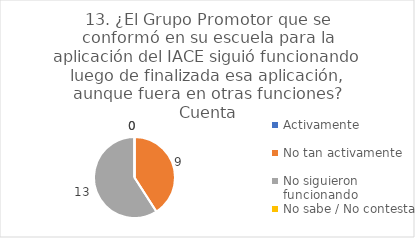
| Category | 13. ¿El Grupo Promotor que se conformó en su escuela para la aplicación del IACE siguió funcionando luego de finalizada esa aplicación, aunque fuera en otras funciones? |
|---|---|
| Activamente  | 0 |
| No tan activamente  | 0.409 |
| No siguieron funcionando  | 0.591 |
| No sabe / No contesta | 0 |